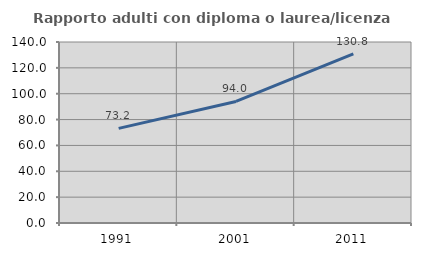
| Category | Rapporto adulti con diploma o laurea/licenza media  |
|---|---|
| 1991.0 | 73.217 |
| 2001.0 | 93.994 |
| 2011.0 | 130.804 |